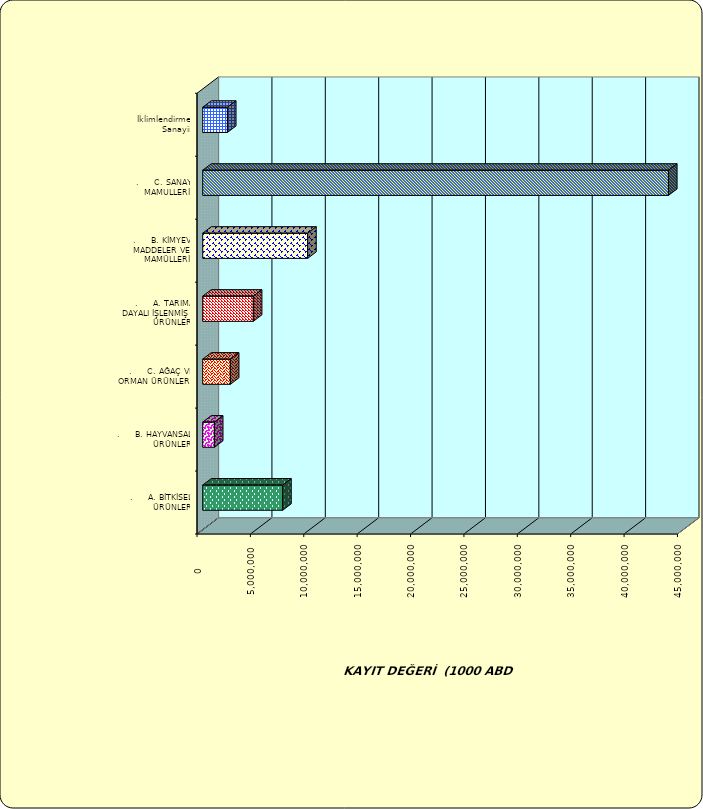
| Category | Series 0 |
|---|---|
| .     A. BİTKİSEL ÜRÜNLER | 7489390.758 |
| .     B. HAYVANSAL ÜRÜNLER | 1096486.821 |
| .     C. AĞAÇ VE ORMAN ÜRÜNLERİ | 2589754.657 |
| .     A. TARIMA DAYALI İŞLENMİŞ ÜRÜNLER | 4740872.027 |
| .     B. KİMYEVİ MADDELER VE MAMÜLLERİ | 9831174.154 |
| .     C. SANAYİ MAMULLERİ | 43623981.078 |
|  İklimlendirme Sanayii | 2317049.773 |